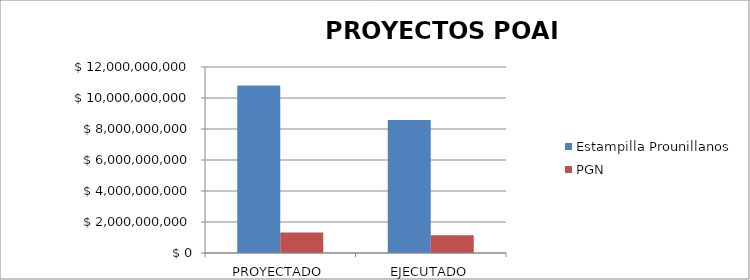
| Category | Estampilla Prounillanos | PGN |
|---|---|---|
| PROYECTADO | 10800000000 | 1321800469 |
| EJECUTADO | 8586933668 | 1149462529 |